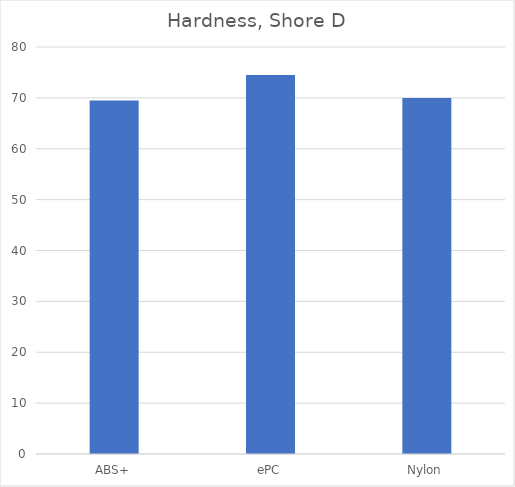
| Category | Shore D |
|---|---|
| ABS+ | 69.5 |
| ePC | 74.5 |
| Nylon | 70 |